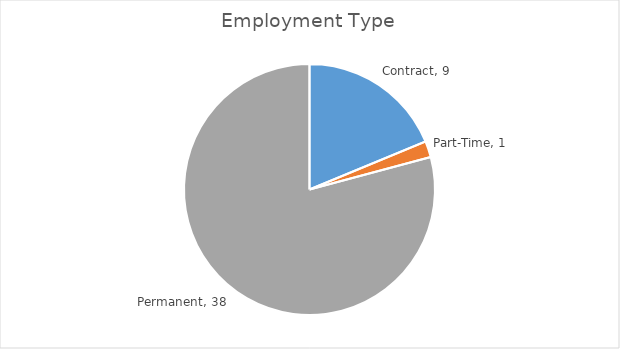
| Category | Qty |
|---|---|
| Contract | 9 |
| Part-Time | 1 |
| Permanent | 38 |